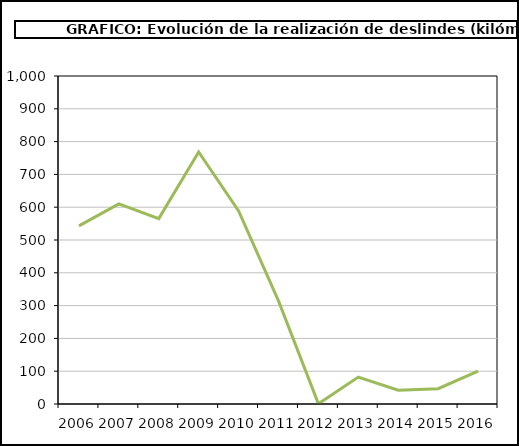
| Category | Series 0 | Series 1 | Series 2 |
|---|---|---|---|
| 2006.0 | 2006 | 7818.854 | 542.899 |
| 2007.0 | 2007 | 8418.16 | 609.979 |
| 2008.0 | 2008 | 8565.436 | 565.426 |
| 2009.0 | 2009 | 9073.921 | 768.343 |
| 2010.0 | 2010 | 9653.484 | 588.854 |
| 2011.0 | 2011 | 9823.304 | 314.421 |
| 2012.0 | 2012 | 9823.89 | 0.6 |
| 2013.0 | 2013 | 9858.3 | 81.928 |
| 2014.0 | 2014 | 9833.276 | 41.8 |
| 2015.0 | 2015 | 9843.639 | 46.663 |
| 2016.0 | 2016 | 9869.868 | 100.58 |